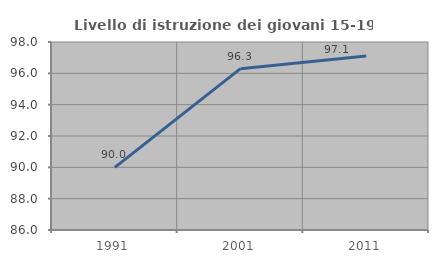
| Category | Livello di istruzione dei giovani 15-19 anni |
|---|---|
| 1991.0 | 90 |
| 2001.0 | 96.296 |
| 2011.0 | 97.101 |